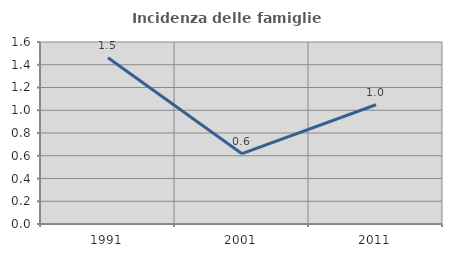
| Category | Incidenza delle famiglie numerose |
|---|---|
| 1991.0 | 1.462 |
| 2001.0 | 0.618 |
| 2011.0 | 1.048 |